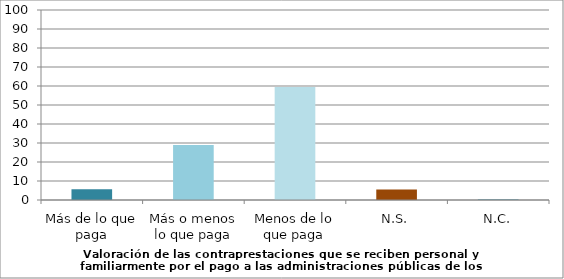
| Category | Series 0 |
|---|---|
| Más de lo que paga | 5.7 |
| Más o menos lo que paga | 29 |
| Menos de lo que paga | 59.5 |
| N.S. | 5.5 |
| N.C. | 0.3 |